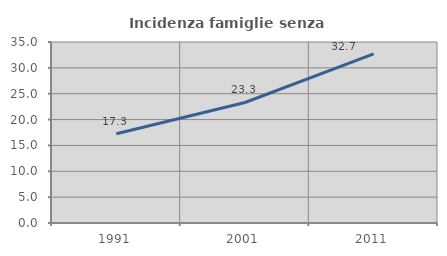
| Category | Incidenza famiglie senza nuclei |
|---|---|
| 1991.0 | 17.261 |
| 2001.0 | 23.306 |
| 2011.0 | 32.721 |